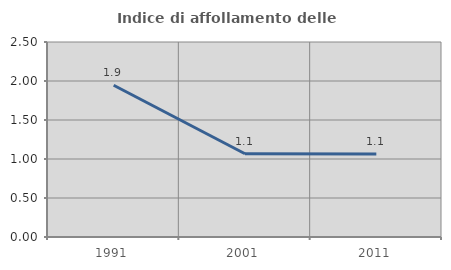
| Category | Indice di affollamento delle abitazioni  |
|---|---|
| 1991.0 | 1.946 |
| 2001.0 | 1.067 |
| 2011.0 | 1.066 |